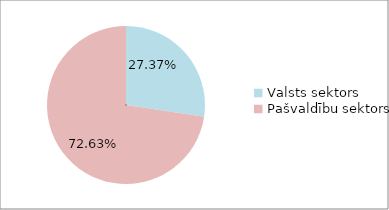
| Category | Series 0 |
|---|---|
| Valsts sektors | 0.274 |
| Pašvaldību sektors | 0.726 |